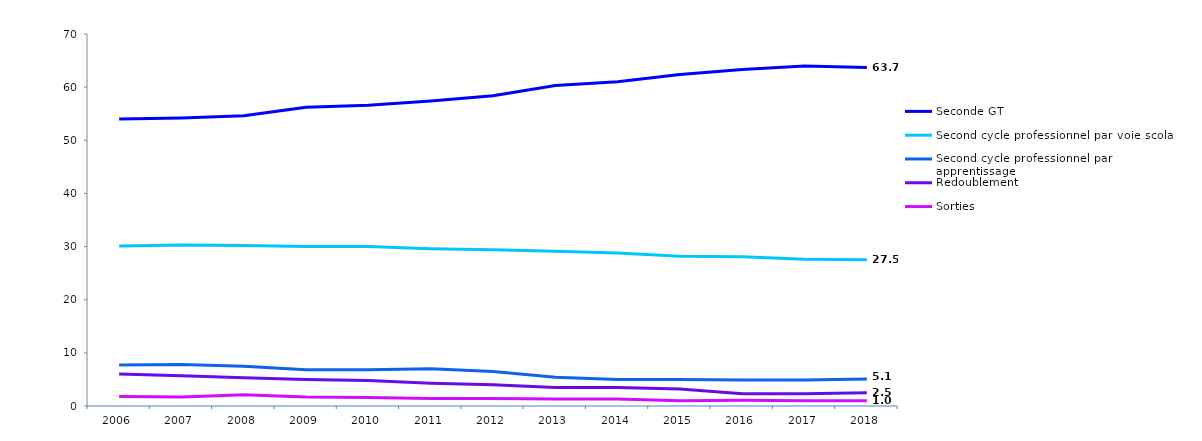
| Category | Seconde GT | Second cycle professionnel par voie scolaire | Second cycle professionnel par apprentissage | Redoublement  | Sorties |
|---|---|---|---|---|---|
| 2006.0 | 54 | 30.1 | 7.7 | 6 | 1.8 |
| 2007.0 | 54.2 | 30.3 | 7.8 | 5.7 | 1.7 |
| 2008.0 | 54.6 | 30.2 | 7.5 | 5.3 | 2.1 |
| 2009.0 | 56.2 | 30 | 6.8 | 5 | 1.7 |
| 2010.0 | 56.6 | 30 | 6.8 | 4.8 | 1.6 |
| 2011.0 | 57.4 | 29.6 | 7 | 4.3 | 1.4 |
| 2012.0 | 58.4 | 29.4 | 6.5 | 4 | 1.4 |
| 2013.0 | 60.3 | 29.1 | 5.4 | 3.5 | 1.3 |
| 2014.0 | 61 | 28.8 | 5 | 3.5 | 1.3 |
| 2015.0 | 62.4 | 28.2 | 5 | 3.2 | 1 |
| 2016.0 | 63.3 | 28.1 | 4.9 | 2.3 | 1.1 |
| 2017.0 | 64 | 27.6 | 4.9 | 2.3 | 1 |
| 2018.0 | 63.7 | 27.5 | 5.1 | 2.5 | 1 |